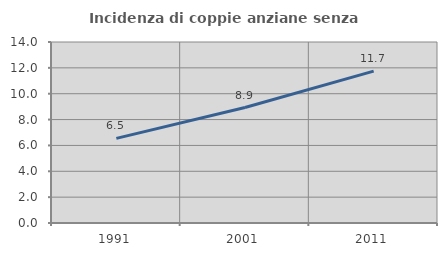
| Category | Incidenza di coppie anziane senza figli  |
|---|---|
| 1991.0 | 6.548 |
| 2001.0 | 8.929 |
| 2011.0 | 11.743 |